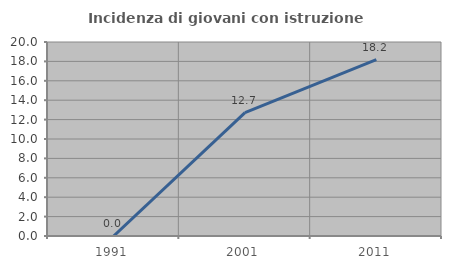
| Category | Incidenza di giovani con istruzione universitaria |
|---|---|
| 1991.0 | 0 |
| 2001.0 | 12.727 |
| 2011.0 | 18.182 |